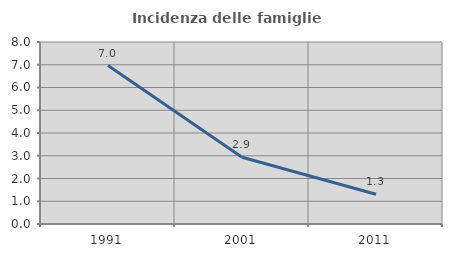
| Category | Incidenza delle famiglie numerose |
|---|---|
| 1991.0 | 6.967 |
| 2001.0 | 2.932 |
| 2011.0 | 1.308 |